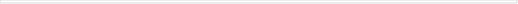
| Category | Total basic infrastructure | Private | Federal | S&L  |
|---|---|---|---|---|
| 1947 | 29809.831 | 16782 | 1318.84 | 11708.991 |
| 1948 | 38947.622 | 20159 | 2777.84 | 16010.782 |
| 1949 | 50447.244 | 23994 | 3399.66 | 23053.584 |
| 1950 | 57093.327 | 25041 | 3900.283 | 28152.044 |
| 1951 | 54428.568 | 24558 | 4820.011 | 25050.557 |
| 1952 | 58125.056 | 26740 | 4982.753 | 26402.303 |
| 1953 | 67028.659 | 29344 | 4732.43 | 32952.229 |
| 1954 | 73084.996 | 23867 | 3753.045 | 45464.951 |
| 1955 | 73001.197 | 19472 | 2651.354 | 50877.843 |
| 1956 | 77910.105 | 21777 | 2964.505 | 53168.6 |
| 1957 | 84134.353 | 24735 | 3699.824 | 55699.529 |
| 1958 | 89569.668 | 20875 | 4620.736 | 64073.932 |
| 1959 | 92736.425 | 17309 | 4974.004 | 70453.421 |
| 1960 | 91220.321 | 17101 | 5592.736 | 68526.585 |
| 1961 | 95911.04 | 13794 | 6656.601 | 75460.439 |
| 1962 | 97629.89 | 13198 | 7261.192 | 77170.698 |
| 1963 | 105736.971 | 13243 | 7309.87 | 85184.101 |
| 1964 | 113683.645 | 16576 | 7646.016 | 89461.629 |
| 1965 | 123422.535 | 21373 | 7980.125 | 94069.41 |
| 1966 | 130043.137 | 26776 | 8195.219 | 95071.918 |
| 1967 | 135267.46 | 34259 | 5779.228 | 95229.232 |
| 1968 | 147315.248 | 40359 | 4739.255 | 102216.993 |
| 1969 | 130508.328 | 37380 | 3321.48 | 89806.848 |
| 1970 | 121458.769 | 36812 | 3359.441 | 81287.328 |
| 1971 | 115070.264 | 35419 | 4095.944 | 75555.32 |
| 1972 | 113854.517 | 39396 | 4211.73 | 70246.787 |
| 1973 | 110498.571 | 42131 | 4407.371 | 63960.2 |
| 1974 | 98468.344 | 35660 | 4115.275 | 58693.069 |
| 1975 | 90965.534 | 32112 | 4216.219 | 54637.315 |
| 1976 | 92482.569 | 33590 | 4372.646 | 54519.923 |
| 1977 | 87565.094 | 30852 | 4749.831 | 51963.263 |
| 1978 | 102871.105 | 28885 | 6308.586 | 67677.519 |
| 1979 | 109962.086 | 28693 | 5811.991 | 75457.095 |
| 1980 | 103646.358 | 26631 | 5350.408 | 71664.95 |
| 1981 | 86266.927 | 25180 | 4978.967 | 56107.96 |
| 1982 | 65389.731 | 17199 | 3418.857 | 44771.874 |
| 1983 | 57720.363 | 10002 | 3154.618 | 44563.745 |
| 1984 | 83562.567 | 21786 | 1957.328 | 59819.239 |
| 1985 | 109018.913 | 35675 | 3011.683 | 70332.23 |
| 1986 | 103027.294 | 27468 | 1484.106 | 74075.188 |
| 1987 | 106256.563 | 28951 | 2201.869 | 75103.694 |
| 1988 | 95044.963 | 14849 | 2488.079 | 77707.884 |
| 1989 | 94132.465 | 17255 | 2210.19 | 74667.275 |
| 1990 | 106041.893 | 21563 | 1464.919 | 83013.974 |
| 1991 | 104175.406 | 20975 | 1921.886 | 81278.52 |
| 1992 | 103089.691 | 20613 | 2963.156 | 79513.535 |
| 1993 | 106739.328 | 23483 | 2857.457 | 80398.871 |
| 1994 | 96257.072 | 11796 | 2644.003 | 81817.069 |
| 1995 | 97291.561 | 21018 | 2377.619 | 73895.942 |
| 1996 | 95123.276 | 18790 | 850.596 | 75482.68 |
| 1997 | 90496.699 | 13078 | -314.411 | 77733.11 |
| 1998 | 103682.102 | 23478 | -444.147 | 80648.249 |
| 1999 | 109074.375 | 22144 | -145.481 | 87075.856 |
| 2000 | 130121.544 | 37208 | -31.287 | 92944.831 |
| 2001 | 140108.699 | 38397 | 398.66 | 101313.039 |
| 2002 | 137164.088 | 32025 | 1194.323 | 103944.765 |
| 2003 | 136075.782 | 30913 | 1604.086 | 103558.696 |
| 2004 | 113651.786 | 14717 | 1313.522 | 97621.264 |
| 2005 | 103549.063 | 16960 | 360.353 | 86228.71 |
| 2006 | 111077.645 | 27167 | 456.343 | 83454.302 |
| 2007 | 130355.174 | 54440 | -32.289 | 75947.463 |
| 2008 | 132167.731 | 61351 | -62.196 | 70878.927 |
| 2009 | 133008.178 | 57055 | 880.139 | 75073.039 |
| 2010 | 116042.262 | 42983 | 2651.799 | 70407.463 |
| 2011 | 103785.424 | 40915 | 2498.897 | 60371.527 |
| 2012 | 112835.409 | 61538 | 526.641 | 50770.768 |
| 2013 | 100694.546 | 55761 | -195.146 | 45128.692 |
| 2014 | 117899.312 | 70623 | 266.964 | 47009.348 |
| 2015 | 114655.595 | 61519 | 1246.82 | 51889.775 |
| 2016 | 113680.358 | 60762 | 986.004 | 51932.354 |
| 2017 | 104263.11 | 58202 | 137.848 | 45923.262 |
| 2018 | 60646 | 60646 | 0 | 0 |